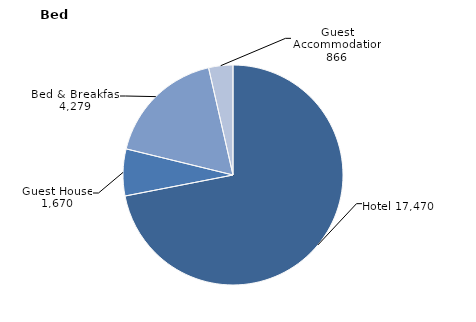
| Category | Series 0 |
|---|---|
| Hotel | 17470 |
| Guest House | 1670 |
| Bed & Breakfast | 4279 |
| Guest Accommodation | 866 |